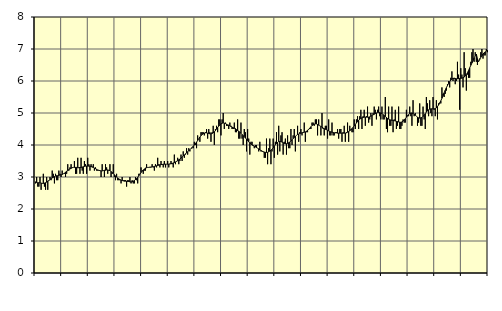
| Category | Information och kommunikation, SNI 58-63 | Series 1 |
|---|---|---|
| nan | 2.8 | 2.85 |
| 87.0 | 3 | 2.83 |
| 87.0 | 2.7 | 2.82 |
| 87.0 | 2.7 | 2.82 |
| 87.0 | 3 | 2.82 |
| 87.0 | 2.6 | 2.81 |
| 87.0 | 2.8 | 2.8 |
| 87.0 | 3.1 | 2.8 |
| 87.0 | 2.7 | 2.81 |
| 87.0 | 2.6 | 2.82 |
| 87.0 | 3 | 2.84 |
| 87.0 | 2.6 | 2.87 |
| nan | 2.9 | 2.89 |
| 88.0 | 3 | 2.92 |
| 88.0 | 2.9 | 2.95 |
| 88.0 | 3.2 | 2.97 |
| 88.0 | 3.1 | 2.99 |
| 88.0 | 2.8 | 3.01 |
| 88.0 | 3.1 | 3.03 |
| 88.0 | 2.9 | 3.04 |
| 88.0 | 2.9 | 3.04 |
| 88.0 | 3.2 | 3.05 |
| 88.0 | 3.1 | 3.06 |
| 88.0 | 3 | 3.07 |
| nan | 3.2 | 3.08 |
| 89.0 | 3.1 | 3.1 |
| 89.0 | 3.1 | 3.12 |
| 89.0 | 3 | 3.15 |
| 89.0 | 3.1 | 3.18 |
| 89.0 | 3.4 | 3.2 |
| 89.0 | 3.2 | 3.23 |
| 89.0 | 3.3 | 3.25 |
| 89.0 | 3.4 | 3.27 |
| 89.0 | 3.3 | 3.29 |
| 89.0 | 3.3 | 3.3 |
| 89.0 | 3.5 | 3.3 |
| nan | 3.1 | 3.3 |
| 90.0 | 3.1 | 3.3 |
| 90.0 | 3.6 | 3.29 |
| 90.0 | 3.3 | 3.29 |
| 90.0 | 3.1 | 3.3 |
| 90.0 | 3.6 | 3.3 |
| 90.0 | 3.2 | 3.31 |
| 90.0 | 3.1 | 3.32 |
| 90.0 | 3.5 | 3.33 |
| 90.0 | 3.4 | 3.34 |
| 90.0 | 3.1 | 3.34 |
| 90.0 | 3.6 | 3.34 |
| nan | 3.4 | 3.34 |
| 91.0 | 3.2 | 3.34 |
| 91.0 | 3.4 | 3.33 |
| 91.0 | 3.3 | 3.32 |
| 91.0 | 3.4 | 3.3 |
| 91.0 | 3.2 | 3.28 |
| 91.0 | 3.3 | 3.26 |
| 91.0 | 3.2 | 3.24 |
| 91.0 | 3.2 | 3.22 |
| 91.0 | 3.2 | 3.21 |
| 91.0 | 3.2 | 3.2 |
| 91.0 | 3 | 3.19 |
| nan | 3.4 | 3.19 |
| 92.0 | 3.2 | 3.2 |
| 92.0 | 3 | 3.21 |
| 92.0 | 3.4 | 3.21 |
| 92.0 | 3.3 | 3.22 |
| 92.0 | 3.1 | 3.22 |
| 92.0 | 3.2 | 3.21 |
| 92.0 | 3.4 | 3.2 |
| 92.0 | 3 | 3.17 |
| 92.0 | 3.1 | 3.14 |
| 92.0 | 3.4 | 3.11 |
| 92.0 | 3 | 3.07 |
| nan | 2.9 | 3.03 |
| 93.0 | 3.1 | 3 |
| 93.0 | 2.9 | 2.97 |
| 93.0 | 2.9 | 2.94 |
| 93.0 | 2.9 | 2.92 |
| 93.0 | 2.8 | 2.9 |
| 93.0 | 3 | 2.89 |
| 93.0 | 2.9 | 2.88 |
| 93.0 | 2.9 | 2.87 |
| 93.0 | 2.9 | 2.87 |
| 93.0 | 2.7 | 2.87 |
| 93.0 | 2.9 | 2.86 |
| nan | 2.9 | 2.86 |
| 94.0 | 3 | 2.85 |
| 94.0 | 2.8 | 2.85 |
| 94.0 | 2.9 | 2.85 |
| 94.0 | 2.8 | 2.87 |
| 94.0 | 2.8 | 2.89 |
| 94.0 | 3 | 2.92 |
| 94.0 | 2.9 | 2.95 |
| 94.0 | 2.8 | 2.99 |
| 94.0 | 3.1 | 3.04 |
| 94.0 | 3.1 | 3.09 |
| 94.0 | 3.3 | 3.14 |
| nan | 3.2 | 3.18 |
| 95.0 | 3.1 | 3.22 |
| 95.0 | 3.2 | 3.25 |
| 95.0 | 3.2 | 3.28 |
| 95.0 | 3.4 | 3.29 |
| 95.0 | 3.3 | 3.3 |
| 95.0 | 3.3 | 3.3 |
| 95.0 | 3.3 | 3.31 |
| 95.0 | 3.3 | 3.31 |
| 95.0 | 3.4 | 3.32 |
| 95.0 | 3.3 | 3.32 |
| 95.0 | 3.2 | 3.33 |
| nan | 3.4 | 3.34 |
| 96.0 | 3.3 | 3.35 |
| 96.0 | 3.6 | 3.36 |
| 96.0 | 3.4 | 3.37 |
| 96.0 | 3.3 | 3.38 |
| 96.0 | 3.5 | 3.39 |
| 96.0 | 3.4 | 3.39 |
| 96.0 | 3.3 | 3.4 |
| 96.0 | 3.5 | 3.4 |
| 96.0 | 3.3 | 3.4 |
| 96.0 | 3.4 | 3.4 |
| 96.0 | 3.5 | 3.4 |
| nan | 3.3 | 3.4 |
| 97.0 | 3.4 | 3.41 |
| 97.0 | 3.5 | 3.42 |
| 97.0 | 3.4 | 3.42 |
| 97.0 | 3.3 | 3.44 |
| 97.0 | 3.7 | 3.45 |
| 97.0 | 3.4 | 3.47 |
| 97.0 | 3.5 | 3.49 |
| 97.0 | 3.6 | 3.51 |
| 97.0 | 3.4 | 3.54 |
| 97.0 | 3.5 | 3.56 |
| 97.0 | 3.7 | 3.59 |
| nan | 3.5 | 3.62 |
| 98.0 | 3.8 | 3.66 |
| 98.0 | 3.6 | 3.69 |
| 98.0 | 3.7 | 3.72 |
| 98.0 | 3.9 | 3.76 |
| 98.0 | 3.7 | 3.79 |
| 98.0 | 3.9 | 3.82 |
| 98.0 | 3.8 | 3.85 |
| 98.0 | 3.9 | 3.89 |
| 98.0 | 3.9 | 3.92 |
| 98.0 | 3.9 | 3.96 |
| 98.0 | 4.1 | 4 |
| nan | 4 | 4.05 |
| 99.0 | 3.9 | 4.09 |
| 99.0 | 4.3 | 4.14 |
| 99.0 | 4.2 | 4.2 |
| 99.0 | 4.1 | 4.25 |
| 99.0 | 4.4 | 4.29 |
| 99.0 | 4.4 | 4.33 |
| 99.0 | 4.4 | 4.35 |
| 99.0 | 4.3 | 4.37 |
| 99.0 | 4.4 | 4.38 |
| 99.0 | 4.5 | 4.38 |
| 99.0 | 4.2 | 4.37 |
| nan | 4.5 | 4.36 |
| 0.0 | 4.4 | 4.35 |
| 0.0 | 4.1 | 4.35 |
| 0.0 | 4.4 | 4.36 |
| 0.0 | 4.6 | 4.38 |
| 0.0 | 4 | 4.41 |
| 0.0 | 4.5 | 4.45 |
| 0.0 | 4.6 | 4.5 |
| 0.0 | 4.4 | 4.55 |
| 0.0 | 4.8 | 4.59 |
| 0.0 | 4.8 | 4.63 |
| 0.0 | 4.3 | 4.66 |
| nan | 4.8 | 4.68 |
| 1.0 | 5 | 4.69 |
| 1.0 | 4.5 | 4.68 |
| 1.0 | 4.7 | 4.67 |
| 1.0 | 4.6 | 4.65 |
| 1.0 | 4.6 | 4.63 |
| 1.0 | 4.5 | 4.62 |
| 1.0 | 4.7 | 4.6 |
| 1.0 | 4.6 | 4.58 |
| 1.0 | 4.5 | 4.56 |
| 1.0 | 4.5 | 4.54 |
| 1.0 | 4.7 | 4.52 |
| nan | 4.4 | 4.51 |
| 2.0 | 4.4 | 4.48 |
| 2.0 | 4.8 | 4.45 |
| 2.0 | 4.2 | 4.43 |
| 2.0 | 4.2 | 4.4 |
| 2.0 | 4.7 | 4.37 |
| 2.0 | 4.2 | 4.33 |
| 2.0 | 4 | 4.29 |
| 2.0 | 4.5 | 4.26 |
| 2.0 | 4.4 | 4.22 |
| 2.0 | 3.8 | 4.18 |
| 2.0 | 4.5 | 4.14 |
| nan | 4.2 | 4.1 |
| 3.0 | 3.7 | 4.06 |
| 3.0 | 4.1 | 4.03 |
| 3.0 | 4.1 | 4 |
| 3.0 | 4 | 3.98 |
| 3.0 | 3.9 | 3.96 |
| 3.0 | 4 | 3.94 |
| 3.0 | 4 | 3.92 |
| 3.0 | 3.9 | 3.9 |
| 3.0 | 3.8 | 3.88 |
| 3.0 | 4.1 | 3.85 |
| 3.0 | 3.8 | 3.83 |
| nan | 3.8 | 3.81 |
| 4.0 | 3.8 | 3.79 |
| 4.0 | 3.6 | 3.78 |
| 4.0 | 3.6 | 3.77 |
| 4.0 | 4.2 | 3.77 |
| 4.0 | 3.4 | 3.77 |
| 4.0 | 3.9 | 3.79 |
| 4.0 | 4.2 | 3.81 |
| 4.0 | 3.4 | 3.83 |
| 4.0 | 3.8 | 3.87 |
| 4.0 | 4.2 | 3.91 |
| 4.0 | 3.6 | 3.96 |
| nan | 4.1 | 4.01 |
| 5.0 | 4.4 | 4.05 |
| 5.0 | 3.7 | 4.08 |
| 5.0 | 4.6 | 4.11 |
| 5.0 | 3.8 | 4.11 |
| 5.0 | 4.3 | 4.11 |
| 5.0 | 4.4 | 4.09 |
| 5.0 | 3.7 | 4.07 |
| 5.0 | 4.1 | 4.05 |
| 5.0 | 4.2 | 4.04 |
| 5.0 | 3.7 | 4.04 |
| 5.0 | 4.3 | 4.05 |
| nan | 3.9 | 4.07 |
| 6.0 | 3.9 | 4.09 |
| 6.0 | 4.5 | 4.13 |
| 6.0 | 4 | 4.16 |
| 6.0 | 4.3 | 4.2 |
| 6.0 | 4.5 | 4.24 |
| 6.0 | 3.8 | 4.27 |
| 6.0 | 4.3 | 4.3 |
| 6.0 | 4.6 | 4.33 |
| 6.0 | 4.1 | 4.34 |
| 6.0 | 4.4 | 4.36 |
| 6.0 | 4.5 | 4.37 |
| nan | 4.3 | 4.38 |
| 7.0 | 4.4 | 4.39 |
| 7.0 | 4.7 | 4.4 |
| 7.0 | 4.1 | 4.41 |
| 7.0 | 4.4 | 4.43 |
| 7.0 | 4.4 | 4.46 |
| 7.0 | 4.5 | 4.49 |
| 7.0 | 4.5 | 4.53 |
| 7.0 | 4.5 | 4.57 |
| 7.0 | 4.7 | 4.61 |
| 7.0 | 4.7 | 4.63 |
| 7.0 | 4.6 | 4.65 |
| nan | 4.8 | 4.66 |
| 8.0 | 4.8 | 4.66 |
| 8.0 | 4.3 | 4.64 |
| 8.0 | 4.8 | 4.62 |
| 8.0 | 4.6 | 4.6 |
| 8.0 | 4.3 | 4.58 |
| 8.0 | 5 | 4.56 |
| 8.0 | 4.5 | 4.53 |
| 8.0 | 4.3 | 4.51 |
| 8.0 | 4.6 | 4.49 |
| 8.0 | 4.6 | 4.48 |
| 8.0 | 4.2 | 4.46 |
| nan | 4.8 | 4.44 |
| 9.0 | 4.3 | 4.42 |
| 9.0 | 4.3 | 4.41 |
| 9.0 | 4.7 | 4.4 |
| 9.0 | 4.3 | 4.39 |
| 9.0 | 4.3 | 4.38 |
| 9.0 | 4.4 | 4.38 |
| 9.0 | 4.4 | 4.38 |
| 9.0 | 4.5 | 4.37 |
| 9.0 | 4.2 | 4.37 |
| 9.0 | 4.5 | 4.37 |
| 9.0 | 4.5 | 4.37 |
| nan | 4.1 | 4.37 |
| 10.0 | 4.4 | 4.37 |
| 10.0 | 4.6 | 4.37 |
| 10.0 | 4.1 | 4.37 |
| 10.0 | 4.4 | 4.38 |
| 10.0 | 4.7 | 4.4 |
| 10.0 | 4.1 | 4.42 |
| 10.0 | 4.6 | 4.44 |
| 10.0 | 4.5 | 4.48 |
| 10.0 | 4.4 | 4.51 |
| 10.0 | 4.4 | 4.55 |
| 10.0 | 4.8 | 4.6 |
| nan | 4.5 | 4.64 |
| 11.0 | 4.8 | 4.69 |
| 11.0 | 4.9 | 4.73 |
| 11.0 | 4.5 | 4.77 |
| 11.0 | 4.9 | 4.81 |
| 11.0 | 5.1 | 4.83 |
| 11.0 | 4.5 | 4.85 |
| 11.0 | 4.9 | 4.86 |
| 11.0 | 5.1 | 4.87 |
| 11.0 | 4.6 | 4.87 |
| 11.0 | 4.9 | 4.87 |
| 11.0 | 5.2 | 4.87 |
| nan | 4.7 | 4.87 |
| 12.0 | 4.8 | 4.88 |
| 12.0 | 5 | 4.9 |
| 12.0 | 4.6 | 4.92 |
| 12.0 | 5 | 4.94 |
| 12.0 | 5.2 | 4.96 |
| 12.0 | 5.1 | 4.98 |
| 12.0 | 4.8 | 5 |
| 12.0 | 5.1 | 5.02 |
| 12.0 | 5.2 | 5.02 |
| 12.0 | 4.9 | 5.01 |
| 12.0 | 4.8 | 5 |
| nan | 5.2 | 4.98 |
| 13.0 | 4.8 | 4.95 |
| 13.0 | 4.8 | 4.92 |
| 13.0 | 5.5 | 4.89 |
| 13.0 | 4.5 | 4.86 |
| 13.0 | 4.4 | 4.83 |
| 13.0 | 5.2 | 4.81 |
| 13.0 | 4.6 | 4.79 |
| 13.0 | 4.6 | 4.78 |
| 13.0 | 5.2 | 4.77 |
| 13.0 | 4.4 | 4.77 |
| 13.0 | 4.8 | 4.76 |
| nan | 5.1 | 4.75 |
| 14.0 | 4.5 | 4.74 |
| 14.0 | 4.6 | 4.73 |
| 14.0 | 5.2 | 4.72 |
| 14.0 | 4.5 | 4.71 |
| 14.0 | 4.5 | 4.71 |
| 14.0 | 4.6 | 4.72 |
| 14.0 | 4.8 | 4.75 |
| 14.0 | 4.7 | 4.78 |
| 14.0 | 4.7 | 4.82 |
| 14.0 | 5.1 | 4.87 |
| 14.0 | 4.9 | 4.92 |
| nan | 4.9 | 4.95 |
| 15.0 | 5.2 | 4.98 |
| 15.0 | 4.9 | 5 |
| 15.0 | 4.6 | 5 |
| 15.0 | 5.4 | 4.98 |
| 15.0 | 4.9 | 4.96 |
| 15.0 | 5 | 4.93 |
| 15.0 | 4.9 | 4.9 |
| 15.0 | 4.6 | 4.87 |
| 15.0 | 4.7 | 4.85 |
| 15.0 | 5.3 | 4.84 |
| 15.0 | 4.6 | 4.85 |
| nan | 4.6 | 4.86 |
| 16.0 | 5.2 | 4.89 |
| 16.0 | 4.8 | 4.93 |
| 16.0 | 4.5 | 4.98 |
| 16.0 | 5.5 | 5.03 |
| 16.0 | 5.3 | 5.07 |
| 16.0 | 4.9 | 5.1 |
| 16.0 | 5.4 | 5.12 |
| 16.0 | 5 | 5.13 |
| 16.0 | 4.9 | 5.13 |
| 16.0 | 5.5 | 5.13 |
| 16.0 | 5.1 | 5.13 |
| nan | 4.9 | 5.14 |
| 17.0 | 5.4 | 5.16 |
| 17.0 | 4.8 | 5.2 |
| 17.0 | 5.3 | 5.25 |
| 17.0 | 5.3 | 5.32 |
| 17.0 | 5.3 | 5.38 |
| 17.0 | 5.8 | 5.46 |
| 17.0 | 5.6 | 5.54 |
| 17.0 | 5.5 | 5.63 |
| 17.0 | 5.6 | 5.71 |
| 17.0 | 5.7 | 5.79 |
| 17.0 | 5.9 | 5.86 |
| nan | 6 | 5.92 |
| 18.0 | 5.8 | 5.98 |
| 18.0 | 6.1 | 6.03 |
| 18.0 | 6.3 | 6.06 |
| 18.0 | 6 | 6.08 |
| 18.0 | 6.1 | 6.08 |
| 18.0 | 5.9 | 6.08 |
| 18.0 | 6 | 6.07 |
| 18.0 | 6.6 | 6.07 |
| 18.0 | 6.2 | 6.07 |
| 18.0 | 5.1 | 6.08 |
| 18.0 | 6.4 | 6.08 |
| nan | 6.2 | 6.09 |
| 19.0 | 5.8 | 6.1 |
| 19.0 | 6.9 | 6.12 |
| 19.0 | 6.4 | 6.16 |
| 19.0 | 5.7 | 6.2 |
| 19.0 | 6.2 | 6.26 |
| 19.0 | 6.1 | 6.33 |
| 19.0 | 6.1 | 6.41 |
| 19.0 | 6.6 | 6.49 |
| 19.0 | 6.9 | 6.56 |
| 19.0 | 7 | 6.64 |
| 19.0 | 6.6 | 6.72 |
| nan | 6.9 | 6.79 |
| 20.0 | 6.6 | 6.84 |
| 20.0 | 6.5 | 6.7 |
| 20.0 | 6.6 | 6.6 |
| 20.0 | 6.7 | 6.67 |
| 20.0 | 6.9 | 6.74 |
| 20.0 | 7 | 6.79 |
| 20.0 | 6.7 | 6.84 |
| 20.0 | 6.8 | 6.88 |
| 20.0 | 6.8 | 6.91 |
| 20.0 | 7 | 6.94 |
| 20.0 | 6.9 | 6.96 |